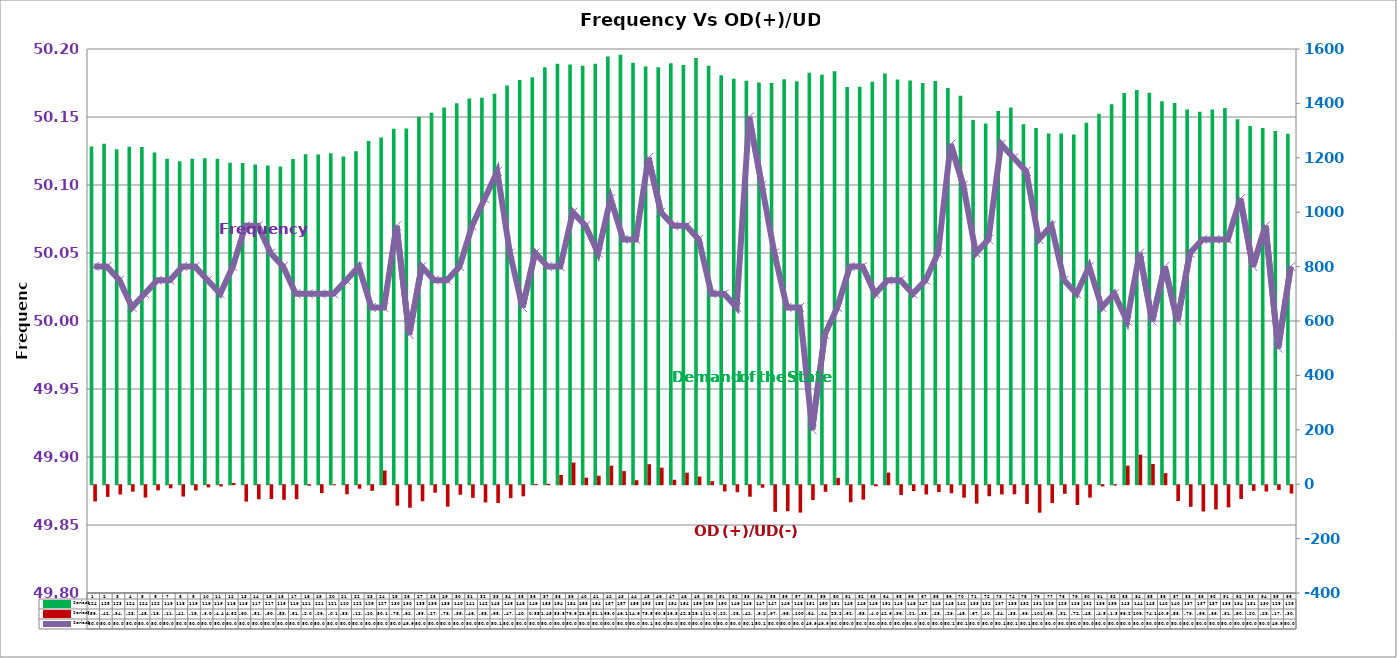
| Category | Series 2 | Series 4 |
|---|---|---|
| 0 | 1241.59 | -59.96 |
| 1 | 1252.01 | -42.85 |
| 2 | 1231.7 | -34.17 |
| 3 | 1240.71 | -23.72 |
| 4 | 1240.03 | -45.46 |
| 5 | 1219.55 | -18.99 |
| 6 | 1196.18 | -11.4 |
| 7 | 1187.36 | -41.69 |
| 8 | 1196.07 | -19.29 |
| 9 | 1198.11 | -8.02 |
| 10 | 1196.1 | -4.42 |
| 11 | 1181.78 | 4.52 |
| 12 | 1180.47 | -60.32 |
| 13 | 1175.52 | -51.84 |
| 14 | 1171.51 | -50.86 |
| 15 | 1168.09 | -53.74 |
| 16 | 1195.36 | -51.45 |
| 17 | 1213.05 | -2.04 |
| 18 | 1212.48 | -29.17 |
| 19 | 1217.08 | -0.12 |
| 20 | 1205.17 | -33.22 |
| 21 | 1224.52 | -12.98 |
| 22 | 1261.42 | -20.59 |
| 23 | 1274.87 | 50.16 |
| 24 | 1306.42 | -75.43 |
| 25 | 1307.55 | -82.96 |
| 26 | 1350.65 | -59 |
| 27 | 1365.69 | -27.64 |
| 28 | 1384.99 | -78.94 |
| 29 | 1400.33 | -35.12 |
| 30 | 1417.8 | -46.82 |
| 31 | 1420.36 | -63.24 |
| 32 | 1435.82 | -65.27 |
| 33 | 1465.52 | -47.63 |
| 34 | 1486.3 | -40.83 |
| 35 | 1496 | 0.35 |
| 36 | 1533.07 | 1.45 |
| 37 | 1545.98 | 33.82 |
| 38 | 1542.99 | 79.61 |
| 39 | 1538.85 | 23.96 |
| 40 | 1545.88 | 31.17 |
| 41 | 1572.77 | 68.04 |
| 42 | 1578.46 | 48.17 |
| 43 | 1549.54 | 14.63 |
| 44 | 1535.92 | 73.5 |
| 45 | 1532.82 | 60.88 |
| 46 | 1547.5 | 16.3 |
| 47 | 1540.78 | 42.34 |
| 48 | 1566.68 | 28.11 |
| 49 | 1538.36 | 11.08 |
| 50 | 1503.76 | -22.83 |
| 51 | 1490.57 | -25.89 |
| 52 | 1483.3 | -42.33 |
| 53 | 1476.96 | -9.29 |
| 54 | 1475.13 | -97.94 |
| 55 | 1488.39 | -95.55 |
| 56 | 1481.73 | -100.49 |
| 57 | 1512.62 | -54.54 |
| 58 | 1505.46 | -24.31 |
| 59 | 1518.36 | 23.24 |
| 60 | 1460.45 | -62.81 |
| 61 | 1461.1 | -53.17 |
| 62 | 1479.75 | -4 |
| 63 | 1510.21 | 42.65 |
| 64 | 1487.86 | -36.18 |
| 65 | 1484.28 | -21.41 |
| 66 | 1474.96 | -33.95 |
| 67 | 1482.73 | -25.23 |
| 68 | 1456.38 | -29.63 |
| 69 | 1427.79 | -45.84 |
| 70 | 1339.36 | -67.63 |
| 71 | 1326.4 | -40.5 |
| 72 | 1371.85 | -34.03 |
| 73 | 1384.57 | -33.48 |
| 74 | 1323.42 | -68.85 |
| 75 | 1309.72 | -101.01 |
| 76 | 1289.05 | -65.6 |
| 77 | 1289.36 | -31.59 |
| 78 | 1286.1 | -72.66 |
| 79 | 1329.24 | -45.66 |
| 80 | 1362.27 | -4.54 |
| 81 | 1396.63 | -1.3 |
| 82 | 1438.38 | 68.27 |
| 83 | 1449.16 | 108.55 |
| 84 | 1438.77 | 74.18 |
| 85 | 1407.86 | 40.69 |
| 86 | 1401.79 | -58.26 |
| 87 | 1377.22 | -79.52 |
| 88 | 1369.61 | -96.55 |
| 89 | 1377.71 | -89.19 |
| 90 | 1382.78 | -81.46 |
| 91 | 1342.01 | -50.42 |
| 92 | 1317.07 | -20.61 |
| 93 | 1309.48 | -23.34 |
| 94 | 1298.35 | -17.66 |
| 95 | 1288.68 | -30.77 |